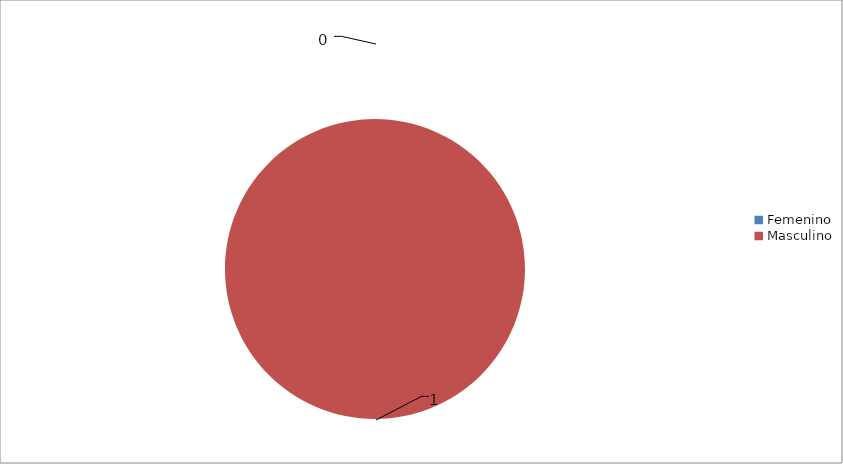
| Category | Series 0 |
|---|---|
| Femenino | 0 |
| Masculino | 1 |